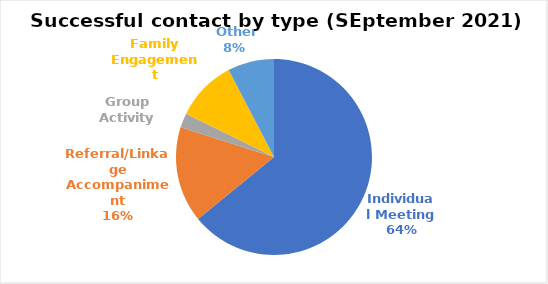
| Category | Series 0 |
|---|---|
| Individual Meeting | 134 |
| Referral/Linkage Accompaniment | 33 |
| Group Activity | 5 |
| Family Engagement | 21 |
|  Other | 16 |